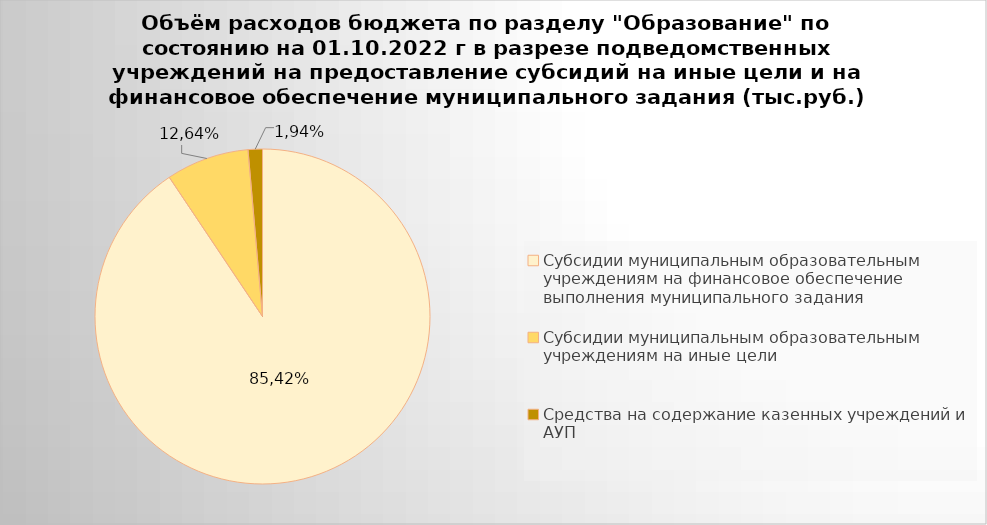
| Category | Series 0 |
|---|---|
| Субсидии муниципальным образовательным учреждениям на финансовое обеспечение выполнения муниципального задания | 7035352.8 |
| Субсидии муниципальным образовательным учреждениям на иные цели | 621981.79 |
| Средства на содержание казенных учреждений и АУП | 107250.66 |